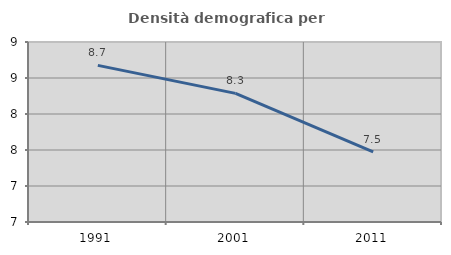
| Category | Densità demografica |
|---|---|
| 1991.0 | 8.675 |
| 2001.0 | 8.286 |
| 2011.0 | 7.474 |